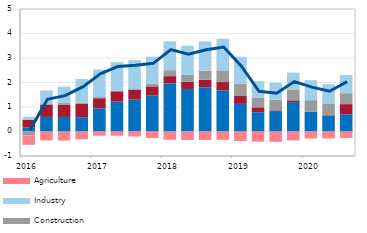
| Category | Other sectors | Trade | Construction | Industry | Agriculture |
|---|---|---|---|---|---|
| 2016 | 0.163 | 0.321 | -0.156 | 0.113 | -0.39 |
| II | 0.595 | 0.508 | 0.015 | 0.558 | -0.363 |
| III | 0.594 | 0.494 | 0.088 | 0.66 | -0.372 |
| IV | 0.585 | 0.553 | 0.046 | 0.96 | -0.322 |
| 2017 | 0.945 | 0.413 | 0.049 | 1.121 | -0.172 |
| II | 1.216 | 0.424 | 0.032 | 1.158 | -0.174 |
| III | 1.297 | 0.414 | 0.02 | 1.182 | -0.205 |
| IV | 1.478 | 0.366 | 0.113 | 1.094 | -0.268 |
| 2018 | 1.962 | 0.298 | 0.242 | 1.18 | -0.338 |
| II | 1.736 | 0.292 | 0.281 | 1.193 | -0.346 |
| III | 1.803 | 0.311 | 0.372 | 1.197 | -0.349 |
| IV | 1.675 | 0.344 | 0.476 | 1.292 | -0.341 |
| 2019 | 1.127 | 0.345 | 0.485 | 1.097 | -0.39 |
| II | 0.785 | 0.202 | 0.402 | 0.668 | -0.414 |
| III | 0.834 | 0.029 | 0.43 | 0.69 | -0.42 |
| IV | 1.2 | 0.072 | 0.444 | 0.687 | -0.366 |
| 2020 | 0.799 | 0.004 | 0.477 | 0.817 | -0.286 |
| II | 0.64 | 0.023 | 0.486 | 0.781 | -0.286 |
| III | 0.703 | 0.414 | 0.446 | 0.741 | -0.267 |